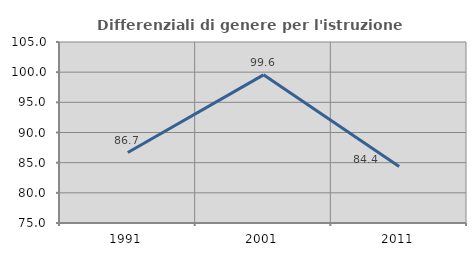
| Category | Differenziali di genere per l'istruzione superiore |
|---|---|
| 1991.0 | 86.685 |
| 2001.0 | 99.558 |
| 2011.0 | 84.375 |